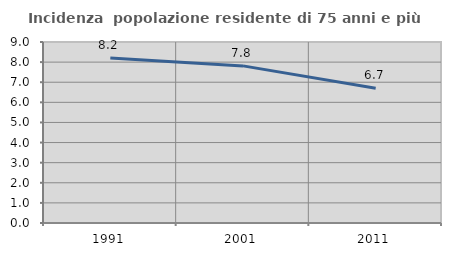
| Category | Incidenza  popolazione residente di 75 anni e più |
|---|---|
| 1991.0 | 8.204 |
| 2001.0 | 7.812 |
| 2011.0 | 6.695 |